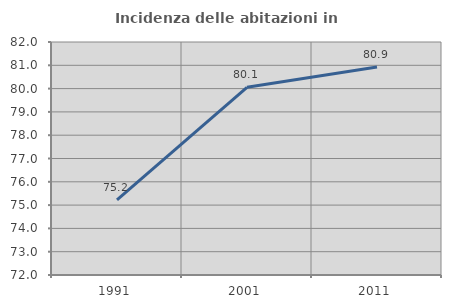
| Category | Incidenza delle abitazioni in proprietà  |
|---|---|
| 1991.0 | 75.224 |
| 2001.0 | 80.056 |
| 2011.0 | 80.925 |